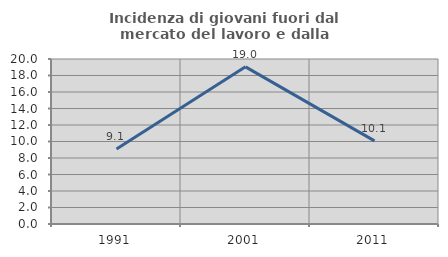
| Category | Incidenza di giovani fuori dal mercato del lavoro e dalla formazione  |
|---|---|
| 1991.0 | 9.091 |
| 2001.0 | 19.048 |
| 2011.0 | 10.072 |